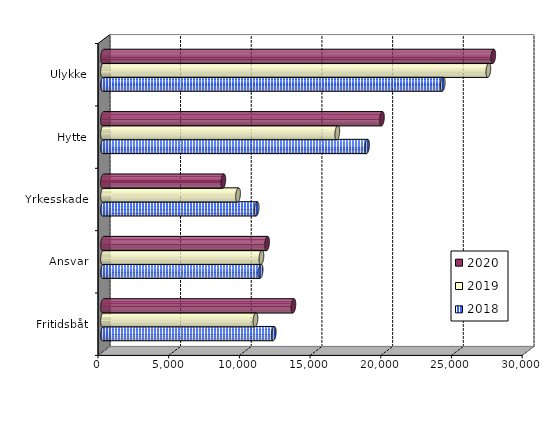
| Category | 2018 | 2019 | 2020 |
|---|---|---|---|
| Fritidsbåt | 12077.195 | 10785.192 | 13466 |
| Ansvar | 11145.096 | 11204.776 | 11603.98 |
| Yrkesskade | 10868.336 | 9550.428 | 8509.779 |
| Hytte | 18679.168 | 16571.543 | 19730 |
| Ulykke | 24026.283 | 27254.8 | 27600.997 |